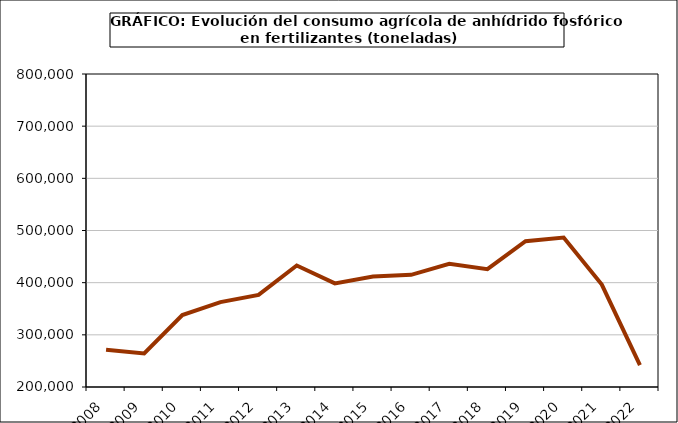
| Category | fertilizantes |
|---|---|
| 2008.0 | 271578 |
| 2009.0 | 264211 |
| 2010.0 | 337812 |
| 2011.0 | 362672 |
| 2012.0 | 376590 |
| 2013.0 | 432904 |
| 2014.0 | 398580 |
| 2015.0 | 411763 |
| 2016.0 | 414974 |
| 2017.0 | 436110 |
| 2018.0 | 425960 |
| 2019.0 | 479562 |
| 2020.0 | 486618 |
| 2021.0 | 396291 |
| 2022.0 | 242114.949 |